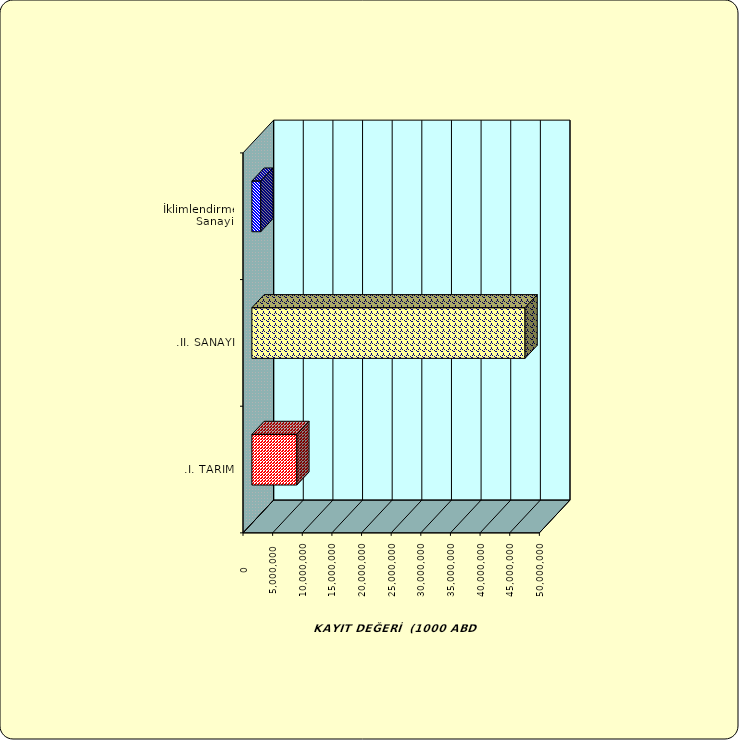
| Category | Series 0 |
|---|---|
| .I. TARIM | 7583715.104 |
| .II. SANAYİ | 46085037.295 |
|  İklimlendirme Sanayii | 1505085.66 |